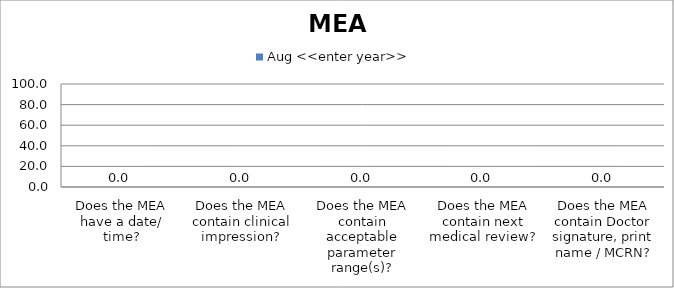
| Category | Aug <<enter year>> |
|---|---|
| Does the MEA have a date/ time? | 0 |
| Does the MEA contain clinical impression? | 0 |
| Does the MEA contain acceptable parameter range(s)? | 0 |
| Does the MEA contain next medical review? | 0 |
| Does the MEA contain Doctor signature, print name / MCRN? | 0 |